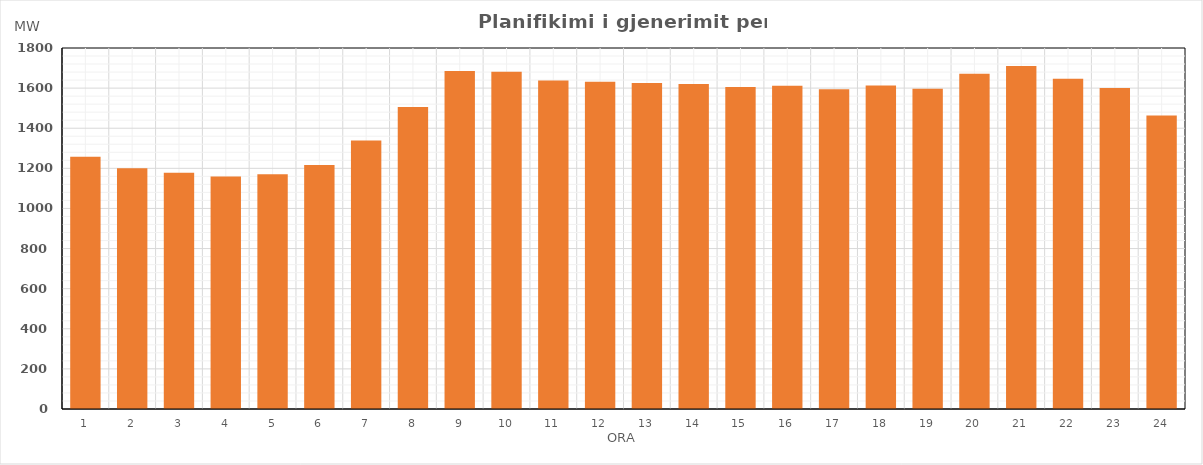
| Category | Max (MW) |
|---|---|
| 0 | 1257.6 |
| 1 | 1200.54 |
| 2 | 1178.24 |
| 3 | 1159.04 |
| 4 | 1170.24 |
| 5 | 1217.11 |
| 6 | 1338.24 |
| 7 | 1506.25 |
| 8 | 1685.13 |
| 9 | 1681.14 |
| 10 | 1637.45 |
| 11 | 1631.18 |
| 12 | 1625.23 |
| 13 | 1620.42 |
| 14 | 1604.93 |
| 15 | 1611.53 |
| 16 | 1593.84 |
| 17 | 1612.55 |
| 18 | 1597.35 |
| 19 | 1671.76 |
| 20 | 1710.22 |
| 21 | 1646.83 |
| 22 | 1600.99 |
| 23 | 1463.12 |